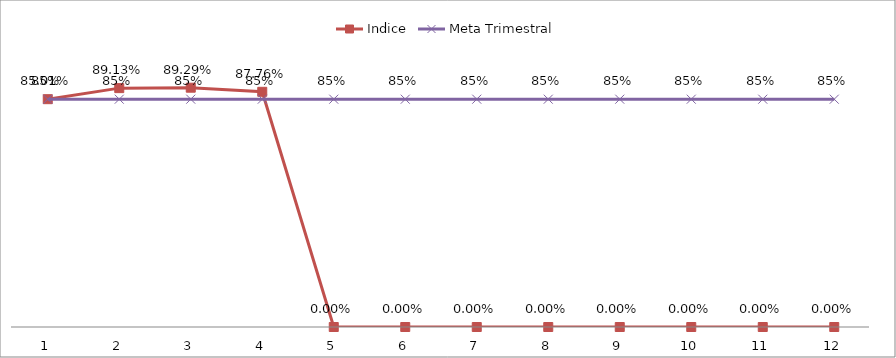
| Category | Indice | Meta Trimestral |
|---|---|---|
| 0 | 0.85 | 0.85 |
| 1 | 0.891 | 0.85 |
| 2 | 0.893 | 0.85 |
| 3 | 0.878 | 0.85 |
| 4 | 0 | 0.85 |
| 5 | 0 | 0.85 |
| 6 | 0 | 0.85 |
| 7 | 0 | 0.85 |
| 8 | 0 | 0.85 |
| 9 | 0 | 0.85 |
| 10 | 0 | 0.85 |
| 11 | 0 | 0.85 |